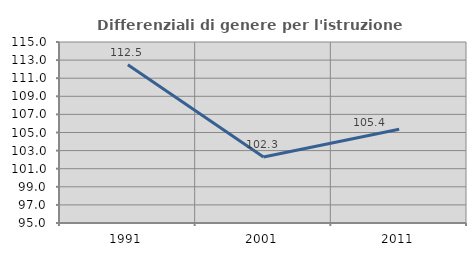
| Category | Differenziali di genere per l'istruzione superiore |
|---|---|
| 1991.0 | 112.476 |
| 2001.0 | 102.285 |
| 2011.0 | 105.36 |